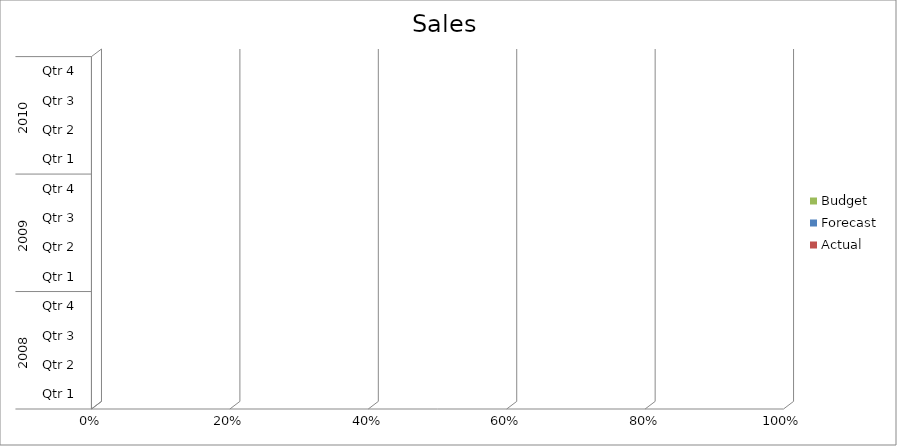
| Category | Budget | Forecast | Actual |
|---|---|---|---|
| 0 | 3010 | 1680 | 1450 |
| 1 | 2310 | 840 | 2420 |
| 2 | 2980 | 2560 | 1900 |
| 3 | 1560 | 1420 | 1490 |
| 4 | 3100 | 560 | 1920 |
| 5 | 830 | 1270 | 2300 |
| 6 | 1590 | 2710 | 1640 |
| 7 | 2680 | 660 | 1980 |
| 8 | 850 | 1410 | 2230 |
| 9 | 1930 | 2300 | 3010 |
| 10 | 1130 | 2170 | 2950 |
| 11 | 1500 | 1300 | 2330 |